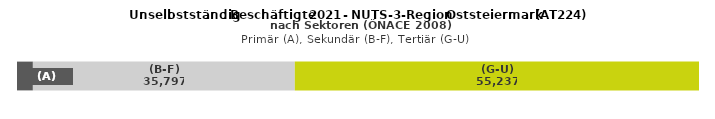
| Category | (A) | (B-F) | (G-U) |
|---|---|---|---|
| 0 | 2170 | 35797 | 55237 |